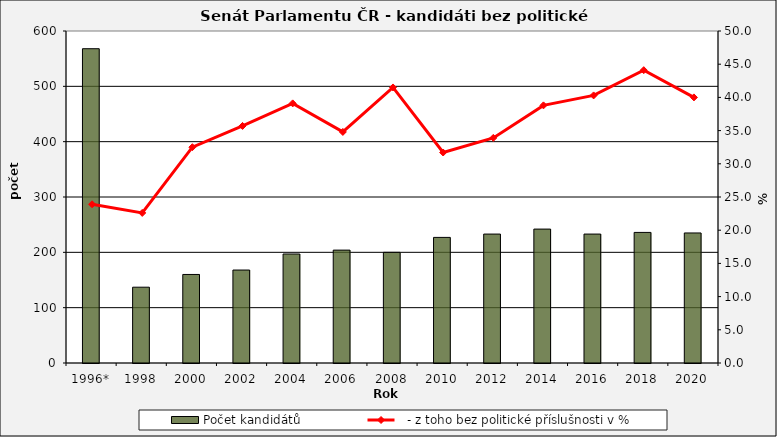
| Category | Počet kandidátů |
|---|---|
| 1996* | 568 |
| 1998 | 137 |
| 2000 | 160 |
| 2002 | 168 |
| 2004 | 197 |
| 2006 | 204 |
| 2008 | 200 |
| 2010 | 227 |
| 2012 | 233 |
| 2014 | 242 |
| 2016 | 233 |
| 2018 | 236 |
| 2020 | 235 |